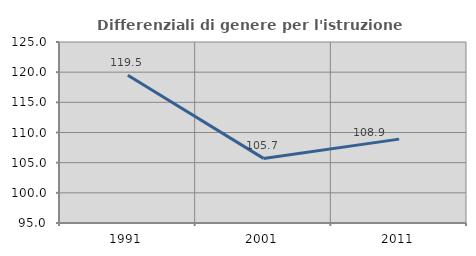
| Category | Differenziali di genere per l'istruzione superiore |
|---|---|
| 1991.0 | 119.5 |
| 2001.0 | 105.707 |
| 2011.0 | 108.903 |